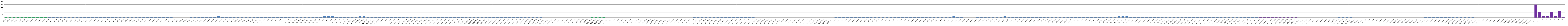
| Category | Series 0 |
|---|---|
| AW01 | 1 |
| AW02 | 1 |
| AW03 | 1 |
| AW04 | 1 |
| AW05 | 1 |
| AW06 | 1 |
| AW07 | 1 |
| AW08 | 1 |
| AW09 | 1 |
| AW10 | 1 |
| AW11 | 1 |
| AW12 | 1 |
| AW13 | 1 |
| AW14 | 1 |
| AW15 | 1 |
| AW16 | 1 |
| AW17 | 1 |
| AW18 | 1 |
| AW19 | 1 |
| AW20 | 1 |
| AW21 | 1 |
| AW22 | 1 |
| AW23 | 1 |
| AW24 | 1 |
| AW25 | 1 |
| AW26 | 1 |
| AW27 | 1 |
| AW28 | 1 |
| AW29 | 1 |
| AW30 | 1 |
| AW31 | 1 |
| AW32 | 1 |
| AW33 | 1 |
| AW34 | 1 |
| AW35 | 1 |
| AW36 | 1 |
| AW37 | 1 |
| AW38 | 1 |
| BW01 | 1 |
| BW02 | 1 |
| BW03 | 1 |
| BWO4 | 1 |
| BW05 | 1 |
| BW06 | 0 |
| BW07 | 0 |
| BW08 | 0 |
| BW09 | 0 |
| BW10 | 1 |
| BW11 | 1 |
| BW12 | 1 |
| BW13 | 1 |
| BW14 | 1 |
| BW15 | 1 |
| BW16 | 1 |
| BW17 | 2 |
| BW18 | 1 |
| BW19 | 1 |
| BW20 | 1 |
| BW21 | 1 |
| BW22 | 1 |
| BW23 | 1 |
| BW24 | 1 |
| BW25 | 1 |
| BW26 | 1 |
| OS.W01 | 1 |
| OS.W02 | 1 |
| OS.W03 | 1 |
| OS.W04 | 1 |
| OS.W05 | 1 |
| OS.W06 | 1 |
| OS.W07 | 1 |
| OS.W08 | 1 |
| OE. W01 | 1 |
| OE. W02 | 1 |
| OE. W03 | 1 |
| OE. W04 | 1 |
| OE. W05 | 1 |
| OE. W06 | 1 |
| OE. W07 | 1 |
| OE. W08 | 1 |
| OE. W09 | 1 |
| OA.W01 | 2 |
| OA.W02 | 2 |
| OA.W03 | 2 |
| OAN. W01 | 1 |
| OAN. W02 | 1 |
| OAN. W03 | 1 |
| OZŚ.W01 | 1 |
| OZŚ.W02 | 1 |
| OZŚ.W03 | 1 |
| OPE.W01 | 2 |
| OPE.W02 | 2 |
| B1OD.W01 | 1 |
| B1OD.W02 | 1 |
| B1OD.W03 | 1 |
| B1OD.W04 | 1 |
| B1OD.W05 | 1 |
| B1OD.W06 | 1 |
| B1OD.W07 | 1 |
| B1PZ.W01 | 1 |
| B1PZ.W02 | 1 |
| B1PZ.W03 | 1 |
| B1PZ.W04 | 1 |
| B1PZ.W05 | 1 |
| B1PZ.W06 | 1 |
| B1PZ.W07 | 1 |
| B1PZ.W08 | 1 |
| B1PS.W01 | 1 |
| B1PS.W02 | 1 |
| B1PS.W03 | 1 |
| B1PS.W04 | 1 |
| B1PS.W05 | 1 |
| B1PS.W06 | 1 |
| B1PS.W07 | 1 |
| B1PS.W08 | 1 |
| B1MŚ.W01 | 1 |
| B1MŚ.W02 | 1 |
| B1MŚ.W03 | 1 |
| B1MŚ.W04 | 1 |
| B1MŚ.W05 | 1 |
| B1MŚ.W06 | 1 |
| B1MŚ.W07 | 1 |
| B1MŚ.W08 | 1 |
| B1PO.W01 | 1 |
| B1PO.W02 | 1 |
| B1PO.W03 | 1 |
| B1PO.W04 | 1 |
| B1PO.W05 | 1 |
| B1PO.W06 | 1 |
| B1PO.W07 | 1 |
| B1PO.W08 | 1 |
| B1EL.W01 | 1 |
| B1EL.W02 | 1 |
| B1EL.W03 | 1 |
| B1EL.W04 | 1 |
| B1EL.W05 | 1 |
| B1EL.W06 | 1 |
| B1.PR.W01 | 0 |
| B1.PR.W02 | 0 |
| B1.PR.W03 | 0 |
| B1.PR.W04 | 0 |
| B1S.W01 | 0 |
| B1S.W02 | 0 |
| B1S.W03 | 0 |
| B1S.W04 | 0 |
| B1S.W05 | 0 |
| B1S.W06 | 0 |
| B1S.W07 | 0 |
| B1S.W08 | 0 |
| B2PW.W01 | 1 |
| B2PW.W02 | 1 |
| B2PW.W03 | 1 |
| B2PW.W04 | 1 |
| B2C.W01 | 0 |
| B2C.W02 | 0 |
| B2C.W03 | 0 |
| B2C.W04 | 0 |
| B2C.W05 | 0 |
| B2C.W06 | 0 |
| B2C.W07 | 0 |
| B2C.W08 | 0 |
| B2K.W01 | 0 |
| B2K.W02 | 0 |
| B2K.W03 | 0 |
| B2K.W04 | 0 |
| B2K.W05 | 0 |
| B2K.W06 | 0 |
| B2U.W01 | 0 |
| B2U.W02 | 0 |
| B2U.W03 | 0 |
| B2U.W04 | 0 |
| B2U.W05 | 0 |
| B2U.W06 | 0 |
| B2U.W07 | 0 |
| B2U.W08 | 0 |
| B2N.W01 | 1 |
| B2N.W02 | 1 |
| B2N.W03 | 1 |
| B2N.W04 | 1 |
| B2N.W05 | 1 |
| B2N.W06 | 1 |
| B2N.W07 | 1 |
| B2N.W08 | 1 |
| B2PP.W01 | 1 |
| B2PP.W02 | 1 |
| B2PP.W03 | 1 |
| B2ŻY.W01 | 1 |
| B2ŻY.W02 | 1 |
| B2ŻY.W03 | 1 |
| B2ŻY.W04 | 1 |
| B2ŻY.W05 | 1 |
| B2O.W01 | 0 |
| B2O.W02 | 0 |
| B2O.W03 | 0 |
| B2O.W04 | 0 |
| B2O.W05 | 0 |
| B2O.W06 | 0 |
| B2O.W07 | 0 |
| B2O.W08 | 0 |
| B2O.W09 | 0 |
| B2D.W01 | 0 |
| B2D.W02 | 0 |
| B2D.W03 | 0 |
| B2D.W04 | 0 |
| B2D.W05 | 0 |
| B2CH.W01 | 0 |
| B2CH.W02 | 0 |
| B2CH.W03 | 0 |
| B2CH.W04 | 0 |
| B2CH.W05 | 0 |
| B2CH.W06 | 0 |
| AU01 | 1 |
| AU02 | 1 |
| AU03 | 1 |
| AU04 | 1 |
| AU05 | 1 |
| AU06 | 1 |
| AU07 | 1 |
| AU08 | 1 |
| AU09 | 1 |
| AU10 | 1 |
| AU11 | 1 |
| AU12 | 1 |
| AU13 | 1 |
| AU14 | 1 |
| AU15 | 1 |
| AU16 | 1 |
| AU17 | 1 |
| AU18 | 1 |
| AU19 | 1 |
| AU20 | 1 |
| AU21 | 1 |
| AU22 | 1 |
| AU23 | 1 |
| AU24 | 1 |
| AU25 | 1 |
| AU26 | 1 |
| AU27 | 1 |
| AU28 | 1 |
| AU29 | 1 |
| BU01 | 1 |
| BU02 | 2 |
| BU03 | 1 |
| BU04 | 1 |
| BU05 | 0 |
| BU06 | 0 |
| BU07 | 0 |
| BU08 | 1 |
| BU09 | 1 |
| BU10 | 1 |
| BU11 | 1 |
| BU12 | 1 |
| BU13 | 1 |
| BU14 | 1 |
| BU15 | 2 |
| BU16 | 1 |
| BU17 | 1 |
| BU18 | 1 |
| BU19 | 1 |
| BU20 | 1 |
| BU21 | 1 |
| BU22 | 1 |
| BU23 | 1 |
| BU24 | 1 |
| BU25 | 1 |
| BU26 | 1 |
| OS.U01 | 1 |
| OS.U02 | 1 |
| OS.U03 | 1 |
| OS.U04 | 1 |
| OS.U05 | 1 |
| OS.U06 | 1 |
| OE. U01 | 1 |
| OE. U02 | 1 |
| OE. U03 | 1 |
| OE. U04 | 1 |
| OE. U05 | 1 |
| OE. U06 | 1 |
| OE. U07 | 1 |
| OE. U08 | 1 |
| OE. U09 | 1 |
| OA. U01 | 1 |
| OA. U02 | 1 |
| OA. U03 | 2 |
| OA. U04 | 2 |
| OA. U05 | 2 |
| OAN.U01 | 1 |
| OAN.U02 | 1 |
| OAN.U03 | 1 |
| OZŚ.U01 | 1 |
| OZŚ.U02 | 1 |
| OZŚ.U03 | 1 |
| OPE.U01 | 1 |
| OPE.U02 | 1 |
| OPE.U03 | 1 |
| B1OD.U01 | 1 |
| B1OD.U02 | 1 |
| B1OD.U03 | 1 |
| B1OD.U04 | 1 |
| B1OD.U05 | 1 |
| B1OD.U06 | 1 |
| B1OD.U07 | 1 |
| B1OD.U08 | 1 |
| B1PZ.U01 | 1 |
| B1PZ.U02 | 1 |
| B1PZ.U03 | 1 |
| B1PZ.U04 | 1 |
| B1PZ.U05 | 1 |
| B1PS.U01 | 1 |
| B1PS.U02 | 1 |
| B1PS.U03 | 1 |
| B1PS.U04 | 1 |
| B1MŚ.U01 | 1 |
| B1MŚ.U02 | 1 |
| B1MŚ.U03 | 1 |
| B1MŚ.U04 | 1 |
| B1MŚ.U05 | 1 |
| B1PO.U01 | 1 |
| B1PO.U02 | 1 |
| B1PO.U03 | 1 |
| B1PO.U04 | 1 |
| B1PO.U05 | 1 |
| B1EL.U01 | 1 |
| B1EL.U02 | 1 |
| B1EL.U03 | 1 |
| B1EL.U04 | 1 |
| B1EL.U05 | 1 |
| B1EL.U06 | 1 |
| B1EL.U07 | 1 |
| B1.RP.U01 | 0 |
| B1.RP.U02 | 0 |
| B1.RP.U03 | 0 |
| B1.RP.U04 | 0 |
| B2S.U01 | 0 |
| B2S.U02 | 0 |
| B2S.U03 | 0 |
| B2S.U04 | 0 |
| B2S.U05 | 0 |
| B2S.U06 | 0 |
| B2PW.U01 | 1 |
| B2PW.U02 | 1 |
| B2PW.U03 | 1 |
| B2PW.U04 | 1 |
| B2C.U01 | 0 |
| B2C.U02 | 0 |
| B2C.U03 | 0 |
| B2C.U04 | 0 |
| B2C.U05 | 0 |
| B2C.U06 | 0 |
| B2C.U07 | 0 |
| B2K.U01 | 0 |
| B2K.U02 | 0 |
| B2K.U03 | 0 |
| B2K.U04 | 0 |
| B2U.U01 | 0 |
| B2U.U02 | 0 |
| B2U.U03 | 0 |
| B2U.U04 | 0 |
| B2U.U05 | 0 |
| B2U.U06 | 0 |
| B2U.U07 | 0 |
| B2N.U01 | 1 |
| B2N.U02 | 1 |
| B2N.U03 | 1 |
| B2N.U04 | 1 |
| B2N.U05 | 1 |
| B2N.U06 | 1 |
| B2N.U07 | 1 |
| B2PP. U01 | 1 |
| B2PP. U02 | 1 |
| B2PP. U03 | 1 |
| B2ŻY. U01 | 1 |
| B2ŻY. U02 | 1 |
| B2ŻY. U03 | 1 |
| B2O.U01 | 0 |
| B2O.U02 | 0 |
| B2O.U03 | 0 |
| B2O.U04 | 0 |
| B2O.U05 | 0 |
| B2O.U06 | 0 |
| B2O.U07 | 0 |
| B2D.U01 | 0 |
| B2D.U02 | 0 |
| B2D.U03 | 0 |
| B2D.U04 | 0 |
| B2D.U05 | 0 |
| B2CH.U01 | 0 |
| B2CH.U02 | 0 |
| B2CH.U03 | 0 |
| B.K1 | 15 |
| B.K2 | 6 |
| B.K3 | 2 |
| B.K4 | 2 |
| B.K5 | 6 |
| B.K6 | 2 |
| B.K7 | 8 |
| B.K8 | 1 |